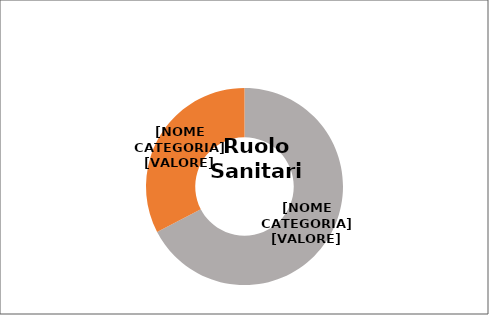
| Category | Series 0 |
|---|---|
| Donne  | 0.674 |
| Uomini  | 0.326 |